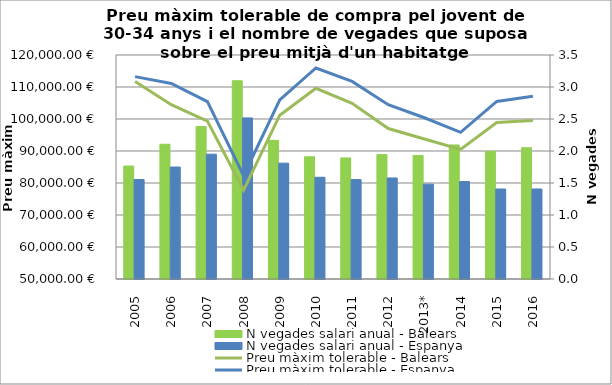
| Category | N vegades salari anual - Balears | N vegades salari anual - Espanya |
|---|---|---|
| 2005 | 1.765 | 1.555 |
| 2006 | 2.105 | 1.75 |
| 2007 | 2.383 | 1.95 |
| 2008 | 3.098 | 2.517 |
| 2009 | 2.167 | 1.81 |
| 2010 | 1.91 | 1.59 |
| 2011 | 1.892 | 1.554 |
| 2012 | 1.944 | 1.579 |
| 2013* | 1.93 | 1.482 |
| 2014 | 2.094 | 1.523 |
| 2015 | 1.993 | 1.406 |
| 2016 | 2.052 | 1.406 |